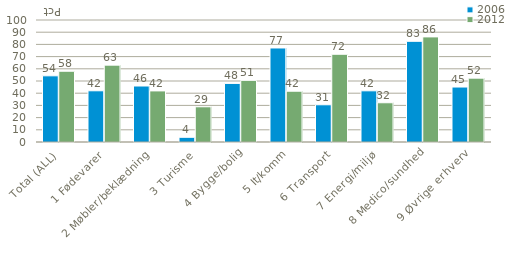
| Category | 2006 | 2012 |
|---|---|---|
| Total (ALL) | 54.252 | 57.996 |
| 1 Fødevarer | 41.973 | 63.006 |
| 2 Møbler/beklædning | 45.89 | 41.869 |
| 3 Turisme | 3.849 | 28.856 |
| 4 Bygge/bolig | 48.037 | 50.518 |
| 5 It/komm | 77.075 | 41.631 |
| 6 Transport | 30.52 | 71.909 |
| 7 Energi/miljø | 41.949 | 32.172 |
| 8 Medico/sundhed | 82.524 | 86.144 |
| 9 Øvrige erhverv | 45.045 | 52.355 |